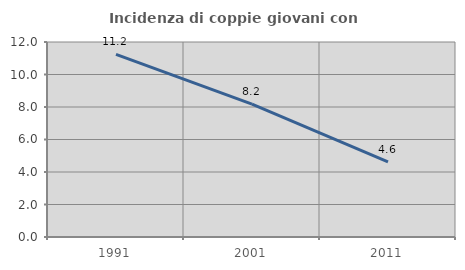
| Category | Incidenza di coppie giovani con figli |
|---|---|
| 1991.0 | 11.239 |
| 2001.0 | 8.173 |
| 2011.0 | 4.623 |